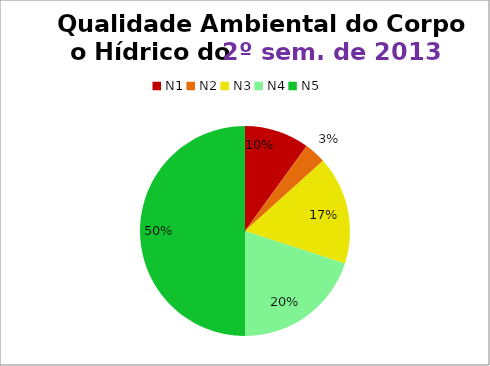
| Category | 2º/13 |
|---|---|
| N1 | 3 |
| N2 | 1 |
| N3 | 5 |
| N4 | 6 |
| N5 | 15 |